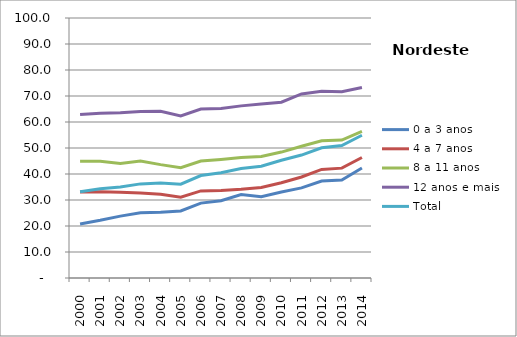
| Category | 0 a 3 anos | 4 a 7 anos | 8 a 11 anos | 12 anos e mais | Total |
|---|---|---|---|---|---|
| 2000.0 | 20.8 | 33.1 | 44.9 | 62.9 | 33.2 |
| 2001.0 | 22.2 | 33.2 | 44.9 | 63.4 | 34.3 |
| 2002.0 | 23.8 | 33 | 44 | 63.6 | 35 |
| 2003.0 | 25.1 | 32.7 | 45 | 64 | 36.2 |
| 2004.0 | 25.3 | 32.2 | 43.6 | 64.1 | 36.5 |
| 2005.0 | 25.8 | 31.1 | 42.4 | 62.3 | 36.1 |
| 2006.0 | 28.8 | 33.5 | 45 | 65 | 39.4 |
| 2007.0 | 29.7 | 33.7 | 45.6 | 65.2 | 40.5 |
| 2008.0 | 32.1 | 34.1 | 46.3 | 66.2 | 42.1 |
| 2009.0 | 31.3 | 34.8 | 46.7 | 66.9 | 43 |
| 2010.0 | 33.094 | 36.617 | 48.43 | 67.611 | 45.273 |
| 2011.0 | 34.651 | 38.84 | 50.661 | 70.809 | 47.29 |
| 2012.0 | 37.276 | 41.743 | 52.765 | 71.84 | 50.072 |
| 2013.0 | 37.696 | 42.255 | 53.058 | 71.673 | 50.955 |
| 2014.0 | 42.279 | 46.362 | 56.385 | 73.284 | 54.9 |